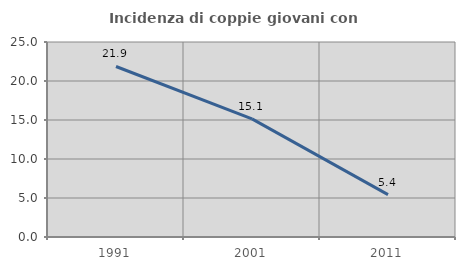
| Category | Incidenza di coppie giovani con figli |
|---|---|
| 1991.0 | 21.86 |
| 2001.0 | 15.139 |
| 2011.0 | 5.439 |